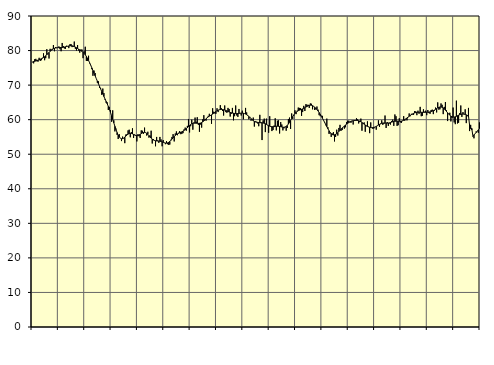
| Category | Piggar | Series 1 |
|---|---|---|
| nan | 76.6 | 76.73 |
| 87.0 | 76.3 | 76.84 |
| 87.0 | 77.5 | 76.89 |
| 87.0 | 77.6 | 77.01 |
| 87.0 | 76.9 | 77.12 |
| 87.0 | 76.8 | 77.24 |
| 87.0 | 77.9 | 77.37 |
| 87.0 | 77 | 77.49 |
| 87.0 | 77.2 | 77.63 |
| 87.0 | 77.9 | 77.78 |
| 87.0 | 79.2 | 77.98 |
| 87.0 | 77.2 | 78.22 |
| nan | 77.8 | 78.5 |
| 88.0 | 80.4 | 78.81 |
| 88.0 | 78.9 | 79.14 |
| 88.0 | 77.7 | 79.47 |
| 88.0 | 80.5 | 79.79 |
| 88.0 | 80.3 | 80.07 |
| 88.0 | 80.5 | 80.31 |
| 88.0 | 81.6 | 80.5 |
| 88.0 | 79.8 | 80.65 |
| 88.0 | 81 | 80.75 |
| 88.0 | 80.7 | 80.81 |
| 88.0 | 80.8 | 80.84 |
| nan | 81.2 | 80.85 |
| 89.0 | 80.4 | 80.85 |
| 89.0 | 79.8 | 80.86 |
| 89.0 | 82.2 | 80.89 |
| 89.0 | 81.3 | 80.94 |
| 89.0 | 80.6 | 81.01 |
| 89.0 | 80.5 | 81.09 |
| 89.0 | 81.4 | 81.17 |
| 89.0 | 81.3 | 81.25 |
| 89.0 | 80.7 | 81.33 |
| 89.0 | 81.8 | 81.37 |
| 89.0 | 81.9 | 81.39 |
| nan | 81 | 81.37 |
| 90.0 | 81.1 | 81.29 |
| 90.0 | 82.6 | 81.17 |
| 90.0 | 80.5 | 81.01 |
| 90.0 | 80 | 80.82 |
| 90.0 | 81.6 | 80.61 |
| 90.0 | 80 | 80.4 |
| 90.0 | 79.4 | 80.19 |
| 90.0 | 80.3 | 79.98 |
| 90.0 | 80.3 | 79.75 |
| 90.0 | 77.8 | 79.49 |
| 90.0 | 79.8 | 79.17 |
| nan | 81.1 | 78.78 |
| 91.0 | 77 | 78.31 |
| 91.0 | 77 | 77.76 |
| 91.0 | 78.5 | 77.14 |
| 91.0 | 76.3 | 76.46 |
| 91.0 | 75.8 | 75.74 |
| 91.0 | 74.6 | 74.99 |
| 91.0 | 72.7 | 74.22 |
| 91.0 | 74.2 | 73.45 |
| 91.0 | 73.5 | 72.68 |
| 91.0 | 71.9 | 71.92 |
| 91.0 | 70.7 | 71.16 |
| nan | 71.1 | 70.4 |
| 92.0 | 69.2 | 69.65 |
| 92.0 | 69.1 | 68.9 |
| 92.0 | 67.2 | 68.15 |
| 92.0 | 69 | 67.42 |
| 92.0 | 67.7 | 66.7 |
| 92.0 | 65.8 | 65.99 |
| 92.0 | 64.9 | 65.3 |
| 92.0 | 65 | 64.59 |
| 92.0 | 62.8 | 63.82 |
| 92.0 | 63.7 | 62.99 |
| 92.0 | 62.8 | 62.08 |
| nan | 59.4 | 61.11 |
| 93.0 | 62.7 | 60.1 |
| 93.0 | 59.8 | 59.08 |
| 93.0 | 56.6 | 58.08 |
| 93.0 | 57.4 | 57.13 |
| 93.0 | 55.6 | 56.27 |
| 93.0 | 54.4 | 55.55 |
| 93.0 | 55.8 | 55 |
| 93.0 | 54.6 | 54.64 |
| 93.0 | 53.8 | 54.48 |
| 93.0 | 55.1 | 54.51 |
| 93.0 | 54.6 | 54.67 |
| nan | 53.2 | 54.94 |
| 94.0 | 55.7 | 55.26 |
| 94.0 | 55.8 | 55.56 |
| 94.0 | 56.9 | 55.82 |
| 94.0 | 57.1 | 55.99 |
| 94.0 | 54.9 | 56.05 |
| 94.0 | 56.4 | 56.02 |
| 94.0 | 57.5 | 55.89 |
| 94.0 | 54.7 | 55.72 |
| 94.0 | 55.7 | 55.54 |
| 94.0 | 55.3 | 55.42 |
| 94.0 | 53.7 | 55.37 |
| nan | 55.8 | 55.42 |
| 95.0 | 55.2 | 55.56 |
| 95.0 | 54.7 | 55.75 |
| 95.0 | 56.9 | 55.97 |
| 95.0 | 56.8 | 56.16 |
| 95.0 | 55.9 | 56.29 |
| 95.0 | 57.7 | 56.33 |
| 95.0 | 56.2 | 56.24 |
| 95.0 | 55.4 | 56.04 |
| 95.0 | 56.5 | 55.75 |
| 95.0 | 54.8 | 55.39 |
| 95.0 | 55.4 | 55.01 |
| nan | 56.8 | 54.67 |
| 96.0 | 53.1 | 54.37 |
| 96.0 | 54.4 | 54.14 |
| 96.0 | 53.9 | 53.99 |
| 96.0 | 52.3 | 53.89 |
| 96.0 | 55 | 53.84 |
| 96.0 | 54 | 53.82 |
| 96.0 | 53.3 | 53.8 |
| 96.0 | 55 | 53.77 |
| 96.0 | 54.3 | 53.69 |
| 96.0 | 52.3 | 53.58 |
| 96.0 | 54.1 | 53.45 |
| nan | 53.3 | 53.33 |
| 97.0 | 52.9 | 53.24 |
| 97.0 | 53.8 | 53.22 |
| 97.0 | 52.9 | 53.28 |
| 97.0 | 52.7 | 53.44 |
| 97.0 | 52.8 | 53.7 |
| 97.0 | 54.2 | 54.02 |
| 97.0 | 55 | 54.39 |
| 97.0 | 55.8 | 54.77 |
| 97.0 | 53.7 | 55.12 |
| 97.0 | 56 | 55.43 |
| 97.0 | 56.6 | 55.69 |
| nan | 55.5 | 55.88 |
| 98.0 | 56.2 | 56.04 |
| 98.0 | 56.7 | 56.18 |
| 98.0 | 55.8 | 56.32 |
| 98.0 | 55.9 | 56.48 |
| 98.0 | 56.1 | 56.68 |
| 98.0 | 57.2 | 56.9 |
| 98.0 | 57.7 | 57.14 |
| 98.0 | 56.8 | 57.4 |
| 98.0 | 58.2 | 57.68 |
| 98.0 | 60.2 | 58 |
| 98.0 | 56.3 | 58.31 |
| nan | 58.1 | 58.58 |
| 99.0 | 60 | 58.8 |
| 99.0 | 57.1 | 58.93 |
| 99.0 | 59.2 | 58.99 |
| 99.0 | 60.6 | 59 |
| 99.0 | 59.4 | 58.98 |
| 99.0 | 60.7 | 58.95 |
| 99.0 | 58.5 | 58.92 |
| 99.0 | 56.5 | 58.95 |
| 99.0 | 58.6 | 59.03 |
| 99.0 | 57.7 | 59.17 |
| 99.0 | 60.1 | 59.36 |
| nan | 61.3 | 59.62 |
| 0.0 | 60.1 | 59.92 |
| 0.0 | 59.7 | 60.23 |
| 0.0 | 60.6 | 60.54 |
| 0.0 | 61.1 | 60.8 |
| 0.0 | 61.7 | 61.02 |
| 0.0 | 61.1 | 61.21 |
| 0.0 | 58.8 | 61.4 |
| 0.0 | 63.3 | 61.61 |
| 0.0 | 62.3 | 61.86 |
| 0.0 | 61.8 | 62.12 |
| 0.0 | 61.7 | 62.37 |
| nan | 63.3 | 62.57 |
| 1.0 | 62.2 | 62.73 |
| 1.0 | 62.9 | 62.86 |
| 1.0 | 64.2 | 62.93 |
| 1.0 | 63.3 | 62.95 |
| 1.0 | 62.5 | 62.93 |
| 1.0 | 61.2 | 62.87 |
| 1.0 | 64.1 | 62.78 |
| 1.0 | 62.2 | 62.67 |
| 1.0 | 62 | 62.53 |
| 1.0 | 63.4 | 62.38 |
| 1.0 | 63.1 | 62.23 |
| nan | 60.9 | 62.1 |
| 2.0 | 61.7 | 62 |
| 2.0 | 63.4 | 61.92 |
| 2.0 | 59.8 | 61.85 |
| 2.0 | 61 | 61.8 |
| 2.0 | 64.1 | 61.76 |
| 2.0 | 61.2 | 61.76 |
| 2.0 | 60.8 | 61.79 |
| 2.0 | 63.1 | 61.83 |
| 2.0 | 61.9 | 61.87 |
| 2.0 | 61.2 | 61.89 |
| 2.0 | 62.6 | 61.89 |
| nan | 60.1 | 61.84 |
| 3.0 | 61.8 | 61.76 |
| 3.0 | 63.4 | 61.63 |
| 3.0 | 62.1 | 61.44 |
| 3.0 | 61.1 | 61.21 |
| 3.0 | 60.1 | 60.92 |
| 3.0 | 60.8 | 60.6 |
| 3.0 | 59.7 | 60.28 |
| 3.0 | 60.2 | 59.97 |
| 3.0 | 60.6 | 59.7 |
| 3.0 | 58 | 59.49 |
| 3.0 | 59.5 | 59.34 |
| nan | 59.4 | 59.26 |
| 4.0 | 58.9 | 59.22 |
| 4.0 | 58.1 | 59.19 |
| 4.0 | 61.4 | 59.16 |
| 4.0 | 59 | 59.13 |
| 4.0 | 54.1 | 59.09 |
| 4.0 | 59.8 | 59.03 |
| 4.0 | 60.3 | 58.94 |
| 4.0 | 56.4 | 58.81 |
| 4.0 | 60.3 | 58.63 |
| 4.0 | 58.4 | 58.44 |
| 4.0 | 56.2 | 58.27 |
| nan | 61 | 58.12 |
| 5.0 | 57.9 | 58.01 |
| 5.0 | 56.7 | 57.95 |
| 5.0 | 57 | 57.95 |
| 5.0 | 58.3 | 57.98 |
| 5.0 | 60.4 | 58.04 |
| 5.0 | 56.9 | 58.09 |
| 5.0 | 59.7 | 58.11 |
| 5.0 | 59.8 | 58.09 |
| 5.0 | 56 | 58.04 |
| 5.0 | 59.3 | 57.96 |
| 5.0 | 58.6 | 57.88 |
| nan | 56.9 | 57.81 |
| 6.0 | 57.5 | 57.8 |
| 6.0 | 57.9 | 57.87 |
| 6.0 | 56.8 | 58.05 |
| 6.0 | 57.6 | 58.35 |
| 6.0 | 60.2 | 58.74 |
| 6.0 | 60.6 | 59.22 |
| 6.0 | 57.3 | 59.77 |
| 6.0 | 61.8 | 60.34 |
| 6.0 | 60.2 | 60.9 |
| 6.0 | 61.2 | 61.4 |
| 6.0 | 62.7 | 61.82 |
| nan | 61.6 | 62.15 |
| 7.0 | 62.6 | 62.4 |
| 7.0 | 63.5 | 62.59 |
| 7.0 | 63.4 | 62.74 |
| 7.0 | 63.3 | 62.86 |
| 7.0 | 61.1 | 62.99 |
| 7.0 | 62.2 | 63.12 |
| 7.0 | 64 | 63.27 |
| 7.0 | 62.5 | 63.46 |
| 7.0 | 64.5 | 63.65 |
| 7.0 | 64.3 | 63.84 |
| 7.0 | 64.3 | 64.01 |
| nan | 63.4 | 64.14 |
| 8.0 | 64.7 | 64.19 |
| 8.0 | 64.6 | 64.17 |
| 8.0 | 63 | 64.05 |
| 8.0 | 63.9 | 63.86 |
| 8.0 | 62.8 | 63.6 |
| 8.0 | 63 | 63.29 |
| 8.0 | 63.8 | 62.93 |
| 8.0 | 62.9 | 62.51 |
| 8.0 | 61.3 | 62.06 |
| 8.0 | 61 | 61.55 |
| 8.0 | 61.1 | 61.01 |
| nan | 61.1 | 60.43 |
| 9.0 | 59.8 | 59.84 |
| 9.0 | 59.1 | 59.22 |
| 9.0 | 58.4 | 58.59 |
| 9.0 | 60.3 | 57.97 |
| 9.0 | 57.8 | 57.36 |
| 9.0 | 55.9 | 56.79 |
| 9.0 | 56 | 56.3 |
| 9.0 | 55 | 55.92 |
| 9.0 | 56 | 55.68 |
| 9.0 | 56.4 | 55.58 |
| 9.0 | 53.7 | 55.62 |
| nan | 55 | 55.75 |
| 10.0 | 57.1 | 55.97 |
| 10.0 | 55.4 | 56.25 |
| 10.0 | 57.6 | 56.56 |
| 10.0 | 58.5 | 56.9 |
| 10.0 | 56.8 | 57.24 |
| 10.0 | 57 | 57.58 |
| 10.0 | 57.9 | 57.9 |
| 10.0 | 57.4 | 58.19 |
| 10.0 | 57.8 | 58.46 |
| 10.0 | 59.3 | 58.71 |
| 10.0 | 59.7 | 58.94 |
| nan | 59.7 | 59.16 |
| 11.0 | 59.4 | 59.34 |
| 11.0 | 59.1 | 59.49 |
| 11.0 | 59.7 | 59.6 |
| 11.0 | 58.6 | 59.68 |
| 11.0 | 59.9 | 59.74 |
| 11.0 | 59.9 | 59.77 |
| 11.0 | 60.4 | 59.78 |
| 11.0 | 60.1 | 59.75 |
| 11.0 | 58.9 | 59.69 |
| 11.0 | 59.3 | 59.57 |
| 11.0 | 60.3 | 59.39 |
| nan | 56.8 | 59.18 |
| 12.0 | 58.8 | 58.94 |
| 12.0 | 59.2 | 58.69 |
| 12.0 | 56.5 | 58.46 |
| 12.0 | 58.1 | 58.24 |
| 12.0 | 59.5 | 58.06 |
| 12.0 | 58 | 57.9 |
| 12.0 | 56.1 | 57.78 |
| 12.0 | 59.2 | 57.7 |
| 12.0 | 57.7 | 57.68 |
| 12.0 | 57.3 | 57.71 |
| 12.0 | 57.5 | 57.78 |
| nan | 57.9 | 57.89 |
| 13.0 | 57.1 | 58.04 |
| 13.0 | 58.3 | 58.23 |
| 13.0 | 59.8 | 58.44 |
| 13.0 | 57.9 | 58.65 |
| 13.0 | 58.7 | 58.83 |
| 13.0 | 59.8 | 58.95 |
| 13.0 | 58.5 | 59.02 |
| 13.0 | 58.8 | 59.04 |
| 13.0 | 61.2 | 59.02 |
| 13.0 | 57.6 | 59 |
| 13.0 | 59.3 | 59 |
| nan | 58.2 | 59.03 |
| 14.0 | 58.9 | 59.09 |
| 14.0 | 58.6 | 59.19 |
| 14.0 | 59.6 | 59.29 |
| 14.0 | 60 | 59.39 |
| 14.0 | 58.2 | 59.47 |
| 14.0 | 61.5 | 59.54 |
| 14.0 | 61 | 59.57 |
| 14.0 | 58.2 | 59.58 |
| 14.0 | 58.4 | 59.56 |
| 14.0 | 60.4 | 59.54 |
| 14.0 | 59.2 | 59.54 |
| nan | 59.1 | 59.58 |
| 15.0 | 59.6 | 59.68 |
| 15.0 | 61 | 59.82 |
| 15.0 | 59.7 | 60.02 |
| 15.0 | 60.1 | 60.24 |
| 15.0 | 59.8 | 60.49 |
| 15.0 | 60.7 | 60.75 |
| 15.0 | 61.8 | 60.98 |
| 15.0 | 61 | 61.22 |
| 15.0 | 61.7 | 61.45 |
| 15.0 | 61.5 | 61.66 |
| 15.0 | 61.4 | 61.82 |
| nan | 62.5 | 61.96 |
| 16.0 | 62.4 | 62.05 |
| 16.0 | 61.3 | 62.1 |
| 16.0 | 62.6 | 62.13 |
| 16.0 | 61.7 | 62.14 |
| 16.0 | 63.7 | 62.14 |
| 16.0 | 61 | 62.14 |
| 16.0 | 61.1 | 62.13 |
| 16.0 | 63 | 62.12 |
| 16.0 | 62.3 | 62.12 |
| 16.0 | 62.6 | 62.12 |
| 16.0 | 61.3 | 62.13 |
| nan | 62.8 | 62.15 |
| 17.0 | 61.9 | 62.19 |
| 17.0 | 61.7 | 62.24 |
| 17.0 | 62.8 | 62.34 |
| 17.0 | 62.9 | 62.47 |
| 17.0 | 61.6 | 62.62 |
| 17.0 | 62.6 | 62.79 |
| 17.0 | 63.5 | 63 |
| 17.0 | 62.1 | 63.21 |
| 17.0 | 65 | 63.41 |
| 17.0 | 62.9 | 63.57 |
| 17.0 | 63 | 63.67 |
| nan | 64.7 | 63.68 |
| 18.0 | 64.3 | 63.58 |
| 18.0 | 61.6 | 63.4 |
| 18.0 | 63.7 | 63.11 |
| 18.0 | 65.1 | 62.75 |
| 18.0 | 62.7 | 62.37 |
| 18.0 | 59.6 | 61.99 |
| 18.0 | 61.6 | 61.62 |
| 18.0 | 62 | 61.29 |
| 18.0 | 59.5 | 61.03 |
| 18.0 | 60.5 | 60.85 |
| 18.0 | 63.5 | 60.75 |
| nan | 59.2 | 60.75 |
| 19.0 | 58.7 | 60.84 |
| 19.0 | 65.5 | 60.97 |
| 19.0 | 58.9 | 61.14 |
| 19.0 | 59.1 | 61.3 |
| 19.0 | 61.9 | 61.44 |
| 19.0 | 64.1 | 61.55 |
| 19.0 | 60.8 | 61.63 |
| 19.0 | 62.2 | 61.65 |
| 19.0 | 61.5 | 61.62 |
| 19.0 | 63 | 61.54 |
| 19.0 | 59 | 61.4 |
| nan | 61 | 61.24 |
| 20.0 | 63.4 | 61.09 |
| 20.0 | 56.7 | 58.45 |
| 20.0 | 58.5 | 57.42 |
| 20.0 | 57 | 57.48 |
| 20.0 | 55.1 | 55.35 |
| 20.0 | 54.6 | 55.6 |
| 20.0 | 55.9 | 55.9 |
| 20.0 | 56.6 | 56.27 |
| 20.0 | 56.7 | 56.66 |
| 20.0 | 56.2 | 57.04 |
| 20.0 | 59.2 | 57.41 |